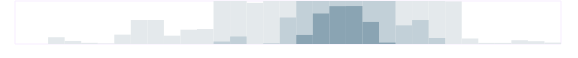
| Category | Маркетинг | Series 1 | Series 2 | Series 3 |
|---|---|---|---|---|
| 0.333333333333333 | 0 | 0 | 0 | 0 |
| nan | 0 | 0 | 0 | 0 |
| nan | 118 | 0 | 0 | 0 |
| nan | 53 | 0 | 0 | 0 |
| 0.416666666666667 | 20 | 0 | 0 | 0 |
| nan | 9 | 0 | 0 | 0 |
| nan | 163 | 0 | 0 | 0 |
| nan | 418 | 0 | 0 | 0 |
| 0.5 | 419 | 0 | 0 | 0 |
| nan | 145 | 0 | 0 | 0 |
| nan | 249 | 0 | 0 | 0 |
| nan | 261 | 0 | 0 | 0 |
| 0.583333333333333 | 750 | 43 | 0 | 0 |
| nan | 750 | 131 | 0 | 0 |
| nan | 717 | 0 | 0 | 0 |
| nan | 750 | 12 | 0 | 0 |
| 0.666666666666667 | 750 | 462 | 0 | 0 |
| nan | 750 | 750 | 158 | 0 |
| nan | 750 | 750 | 532 | 0 |
| nan | 750 | 750 | 660 | 0 |
| 0.75 | 750 | 750 | 662 | 0 |
| nan | 750 | 750 | 385 | 0 |
| nan | 750 | 750 | 25 | 0 |
| nan | 750 | 325 | 0 | 0 |
| 0.833333333333333 | 750 | 418 | 0 | 0 |
| nan | 750 | 105 | 0 | 0 |
| nan | 743 | 0 | 0 | 0 |
| nan | 96 | 0 | 0 | 0 |
| 0.916666666666667 | 19 | 0 | 0 | 0 |
| nan | 19 | 0 | 0 | 0 |
| nan | 66 | 0 | 0 | 0 |
| nan | 49 | 0 | 0 | 0 |
| 0.9993055555555556 | 24 | 0 | 0 | 0 |